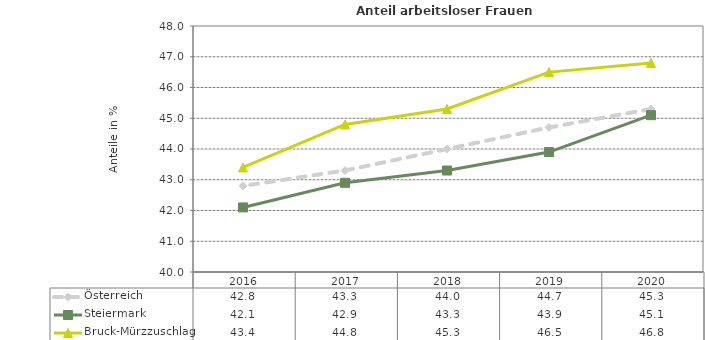
| Category | Österreich | Steiermark | Bruck-Mürzzuschlag |
|---|---|---|---|
| 2020.0 | 45.3 | 45.1 | 46.8 |
| 2019.0 | 44.7 | 43.9 | 46.5 |
| 2018.0 | 44 | 43.3 | 45.3 |
| 2017.0 | 43.3 | 42.9 | 44.8 |
| 2016.0 | 42.8 | 42.1 | 43.4 |